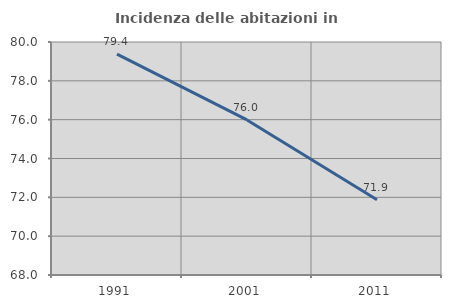
| Category | Incidenza delle abitazioni in proprietà  |
|---|---|
| 1991.0 | 79.373 |
| 2001.0 | 75.987 |
| 2011.0 | 71.88 |